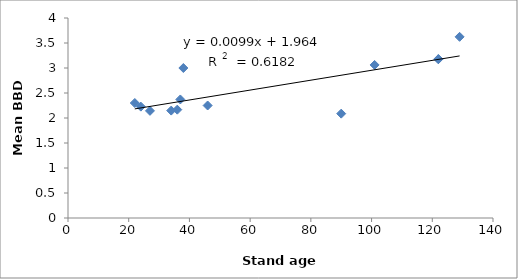
| Category | Series 0 |
|---|---|
| 22.0 | 2.3 |
| 24.0 | 2.227 |
| 27.0 | 2.143 |
| 34.0 | 2.148 |
| 36.0 | 2.167 |
| 37.0 | 2.371 |
| 122.0 | 3.179 |
| 129.0 | 3.623 |
| 122.0 | 3.175 |
| 46.0 | 2.25 |
| 101.0 | 3.061 |
| 38.0 | 3 |
| 90.0 | 2.087 |